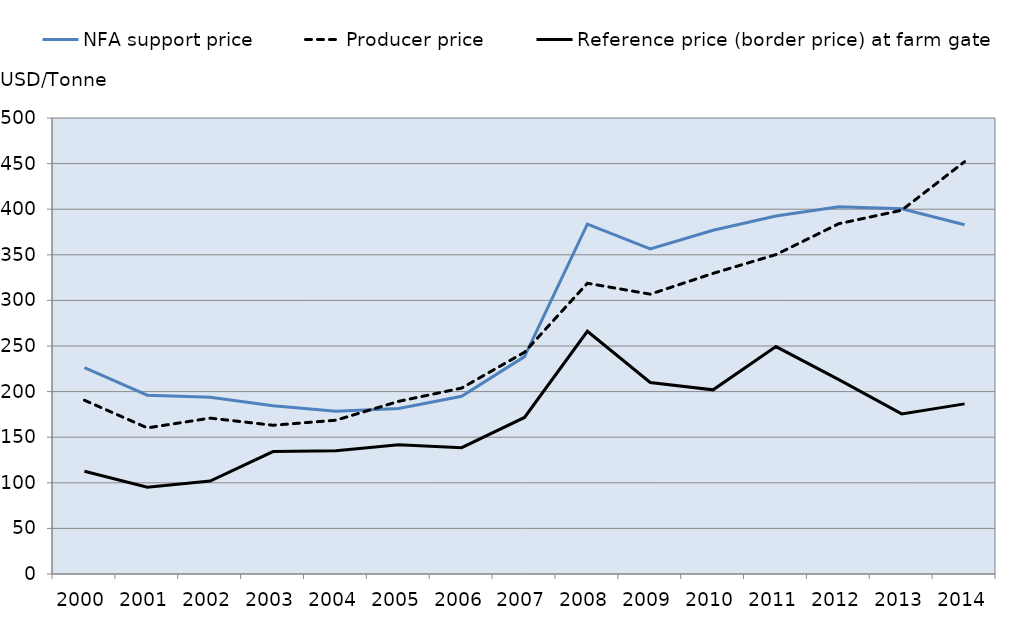
| Category | NFA support price | Producer price | Reference price (border price) at farm gate |
|---|---|---|---|
| 2000.0 | 226.284 | 190.531 | 112.728 |
| 2001.0 | 196.107 | 160.219 | 95.103 |
| 2002.0 | 193.785 | 170.918 | 101.928 |
| 2003.0 | 184.49 | 163.09 | 134.299 |
| 2004.0 | 178.444 | 168.63 | 135.135 |
| 2005.0 | 181.536 | 189.342 | 141.818 |
| 2006.0 | 194.878 | 203.842 | 138.531 |
| 2007.0 | 238.362 | 243.129 | 171.636 |
| 2008.0 | 383.546 | 318.794 | 266.148 |
| 2009.0 | 356.546 | 306.839 | 210.021 |
| 2010.0 | 376.859 | 329.641 | 201.916 |
| 2011.0 | 392.491 | 350.24 | 249.377 |
| 2012.0 | 402.569 | 384.098 | 213.121 |
| 2013.0 | 400.507 | 398.858 | 175.542 |
| 2014.0 | 382.925 | 452.076 | 186.554 |